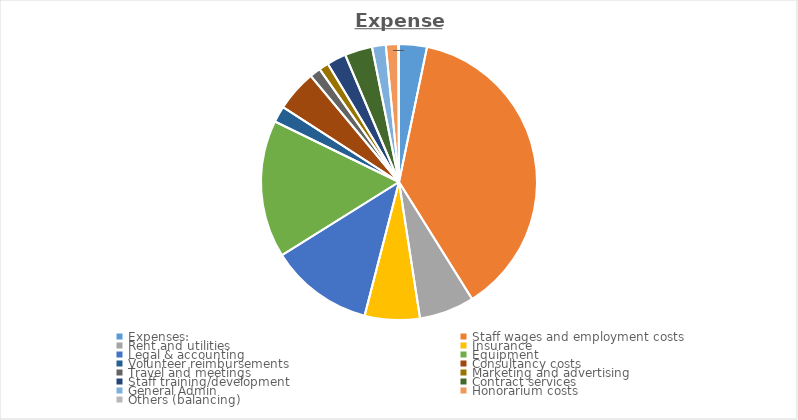
| Category | Series 0 | Series 1 |
|---|---|---|
| Expenses: | 2023 | 2024 |
| Staff wages and employment costs  | 23475 | 24179.25 |
| Rent and utilities | 4000 | 4120 |
| Insurance | 4000 | 4120 |
| Legal & accounting | 7500 | 7725 |
| Equipment | 10000 | 10300 |
| Volunteer reimbursements  | 1173.75 | 1208.962 |
| Consultancy costs | 3000 | 3090 |
| Travel and meetings | 800 | 824 |
| Marketing and advertising | 700 | 721 |
| Staff training/development | 1400 | 1442 |
| Contract services | 2000 | 2060 |
| General Admin  | 1000 | 1030 |
| Honorarium costs  | 900 | 927 |
| Others (balancing) | 51.25 | 52.787 |